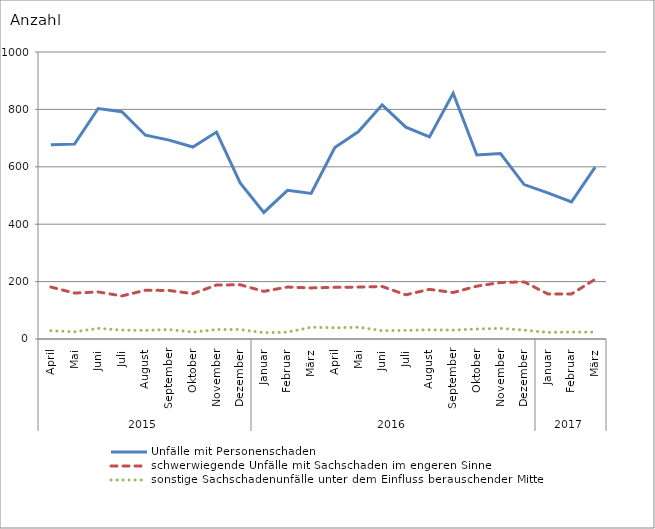
| Category | Unfälle mit Personenschaden | schwerwiegende Unfälle mit Sachschaden im engeren Sinne | sonstige Sachschadenunfälle unter dem Einfluss berauschender Mittel |
|---|---|---|---|
| 0 | 677 | 181 | 29 |
| 1 | 679 | 160 | 25 |
| 2 | 803 | 164 | 37 |
| 3 | 792 | 150 | 31 |
| 4 | 710 | 170 | 30 |
| 5 | 693 | 169 | 33 |
| 6 | 669 | 158 | 24 |
| 7 | 721 | 188 | 33 |
| 8 | 544 | 189 | 33 |
| 9 | 441 | 166 | 22 |
| 10 | 518 | 181 | 24 |
| 11 | 507 | 178 | 41 |
| 12 | 667 | 180 | 39 |
| 13 | 723 | 181 | 41 |
| 14 | 816 | 183 | 29 |
| 15 | 738 | 154 | 30 |
| 16 | 704 | 173 | 32 |
| 17 | 856 | 162 | 31 |
| 18 | 641 | 184 | 35 |
| 19 | 646 | 197 | 37 |
| 20 | 538 | 199 | 31 |
| 21 | 509 | 157 | 23 |
| 22 | 478 | 157 | 24 |
| 23 | 599 | 208 | 24 |